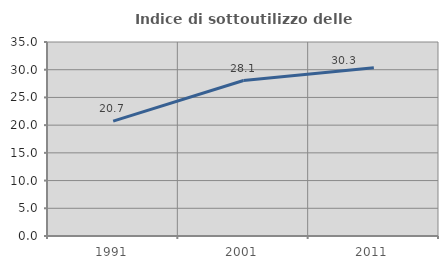
| Category | Indice di sottoutilizzo delle abitazioni  |
|---|---|
| 1991.0 | 20.728 |
| 2001.0 | 28.053 |
| 2011.0 | 30.339 |